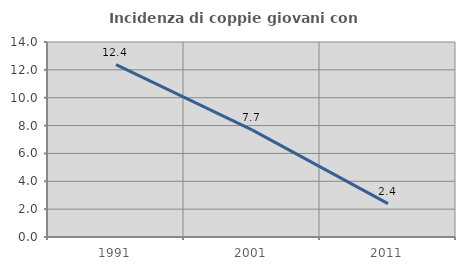
| Category | Incidenza di coppie giovani con figli |
|---|---|
| 1991.0 | 12.376 |
| 2001.0 | 7.692 |
| 2011.0 | 2.395 |